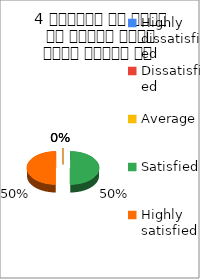
| Category | 4 शिक्षक ने विषय के प्रति रूचि रूचि जागृत की  |
|---|---|
| Highly dissatisfied | 0 |
| Dissatisfied | 0 |
| Average | 0 |
| Satisfied | 1 |
| Highly satisfied | 1 |